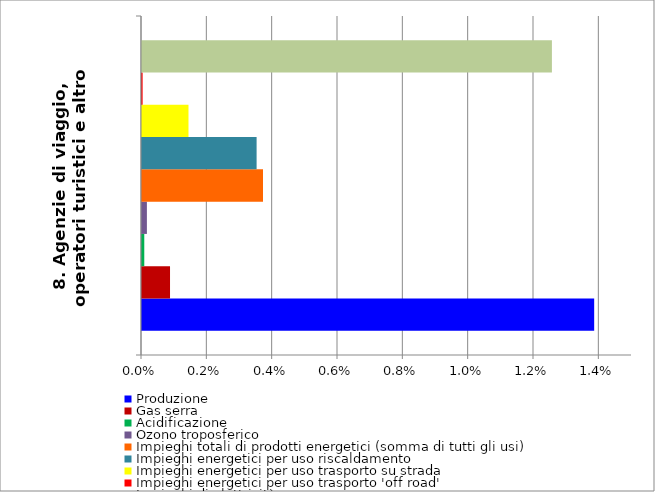
| Category | Produzione | Gas serra | Acidificazione | Ozono troposferico | Impieghi totali di prodotti energetici (somma di tutti gli usi) | Impieghi energetici per uso riscaldamento | Impieghi energetici per uso trasporto su strada | Impieghi energetici per uso trasporto 'off road' | Impieghi di elettricità |
|---|---|---|---|---|---|---|---|---|---|
| 8. Agenzie di viaggio, operatori turistici e altro | 0.014 | 0.001 | 0 | 0 | 0.004 | 0.004 | 0.001 | 0 | 0.013 |